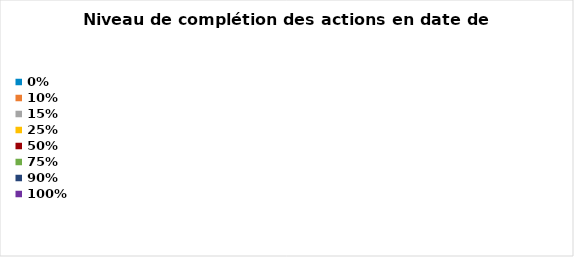
| Category | 2023 |
|---|---|
| 0.0 | 0 |
| 0.1 | 0 |
| 0.15 | 0 |
| 0.25 | 0 |
| 0.5 | 0 |
| 0.75 | 0 |
| 0.9 | 0 |
| 1.0 | 0 |